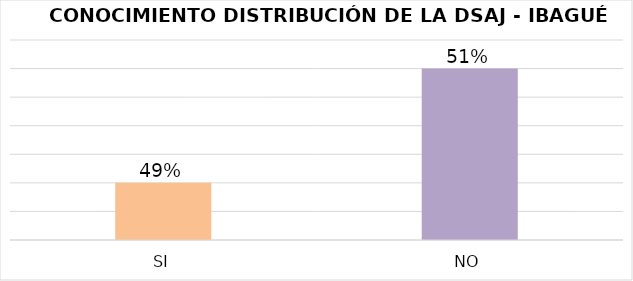
| Category | Series 4 |
|---|---|
| SI | 0.49 |
| NO | 0.51 |